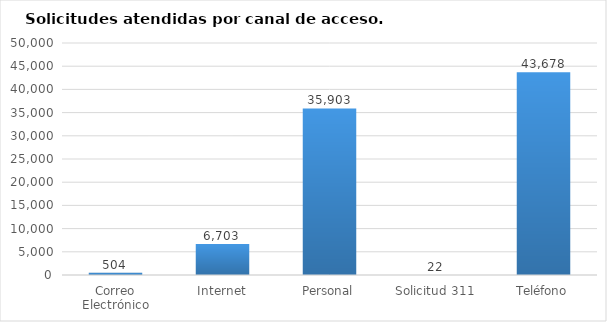
| Category | Total |
|---|---|
| Correo Electrónico | 504 |
| Internet | 6703 |
| Personal | 35903 |
| Solicitud 311 | 22 |
| Teléfono | 43678 |